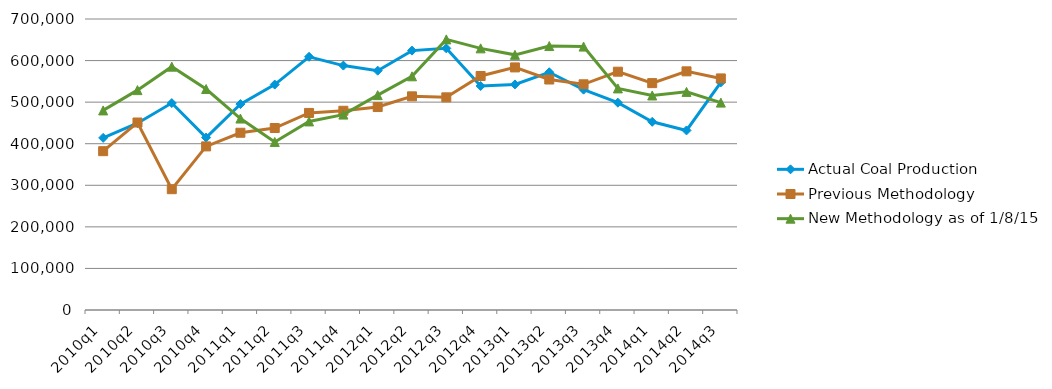
| Category | Actual Coal Production | Previous Methodology | New Methodology as of 1/8/15 |
|---|---|---|---|
| 2010q1 | 414052 | 382031 | 480107 |
| 2010q2 | 449383 | 451019 | 528917 |
| 2010q3 | 497825 | 290606 | 585344 |
| 2010q4 | 414830 | 393539 | 531566 |
| 2011q1 | 495328 | 426339 | 460550 |
| 2011q2 | 542317 | 437772 | 404263 |
| 2011q3 | 609135 | 474070 | 453588 |
| 2011q4 | 587945 | 479236 | 470030 |
| 2012q1 | 575677 | 488226 | 516847 |
| 2012q2 | 623986 | 513970 | 562148 |
| 2012q3 | 629395 | 511579 | 650959 |
| 2012q4 | 538857 | 562879 | 629360 |
| 2013q1 | 542606 | 583534 | 613786 |
| 2013q2 | 571897 | 554418 | 634916 |
| 2013q3 | 530068 | 542949 | 633645 |
| 2013q4 | 498706 | 573238 | 533050 |
| 2014q1 | 452655 | 545776 | 516046 |
| 2014q2 | 431946 | 574090 | 524692 |
| 2014q3 | 547471 | 557058 | 498855 |